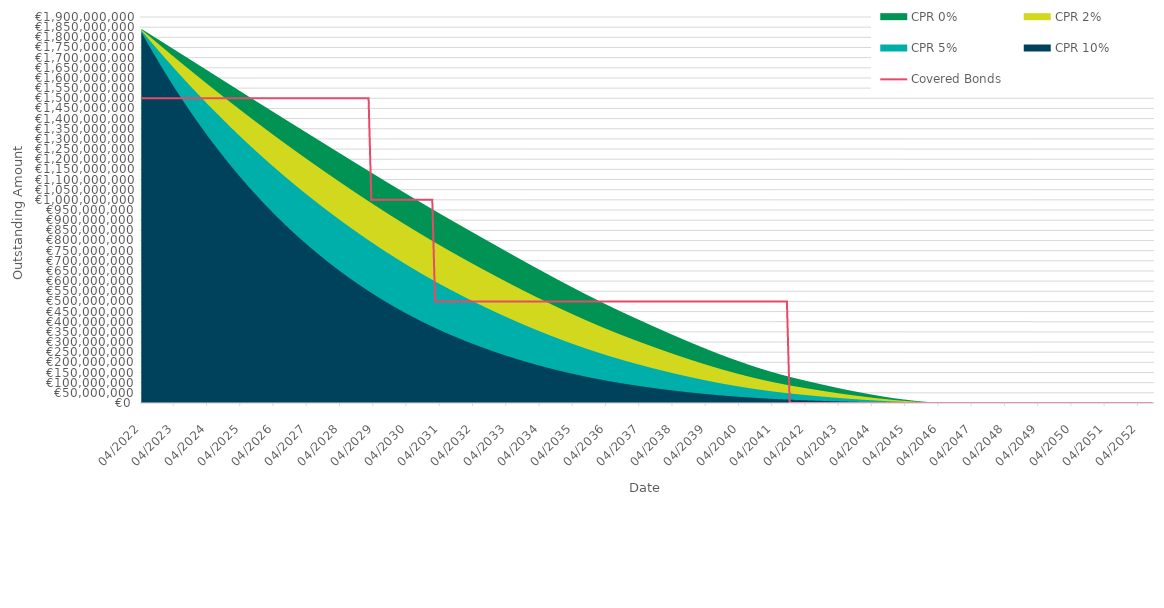
| Category | Covered Bonds |
|---|---|
| 2022-04-30 | 1500000000 |
| 2022-05-31 | 1500000000 |
| 2022-06-30 | 1500000000 |
| 2022-07-31 | 1500000000 |
| 2022-08-31 | 1500000000 |
| 2022-09-30 | 1500000000 |
| 2022-10-31 | 1500000000 |
| 2022-11-30 | 1500000000 |
| 2022-12-31 | 1500000000 |
| 2023-01-31 | 1500000000 |
| 2023-02-28 | 1500000000 |
| 2023-03-31 | 1500000000 |
| 2023-04-30 | 1500000000 |
| 2023-05-31 | 1500000000 |
| 2023-06-30 | 1500000000 |
| 2023-07-31 | 1500000000 |
| 2023-08-31 | 1500000000 |
| 2023-09-30 | 1500000000 |
| 2023-10-31 | 1500000000 |
| 2023-11-30 | 1500000000 |
| 2023-12-31 | 1500000000 |
| 2024-01-31 | 1500000000 |
| 2024-02-29 | 1500000000 |
| 2024-03-31 | 1500000000 |
| 2024-04-30 | 1500000000 |
| 2024-05-31 | 1500000000 |
| 2024-06-30 | 1500000000 |
| 2024-07-31 | 1500000000 |
| 2024-08-31 | 1500000000 |
| 2024-09-30 | 1500000000 |
| 2024-10-31 | 1500000000 |
| 2024-11-30 | 1500000000 |
| 2024-12-31 | 1500000000 |
| 2025-01-31 | 1500000000 |
| 2025-02-28 | 1500000000 |
| 2025-03-31 | 1500000000 |
| 2025-04-30 | 1500000000 |
| 2025-05-31 | 1500000000 |
| 2025-06-30 | 1500000000 |
| 2025-07-31 | 1500000000 |
| 2025-08-31 | 1500000000 |
| 2025-09-30 | 1500000000 |
| 2025-10-31 | 1500000000 |
| 2025-11-30 | 1500000000 |
| 2025-12-31 | 1500000000 |
| 2026-01-31 | 1500000000 |
| 2026-02-28 | 1500000000 |
| 2026-03-31 | 1500000000 |
| 2026-04-30 | 1500000000 |
| 2026-05-31 | 1500000000 |
| 2026-06-30 | 1500000000 |
| 2026-07-31 | 1500000000 |
| 2026-08-31 | 1500000000 |
| 2026-09-30 | 1500000000 |
| 2026-10-31 | 1500000000 |
| 2026-11-30 | 1500000000 |
| 2026-12-31 | 1500000000 |
| 2027-01-31 | 1500000000 |
| 2027-02-28 | 1500000000 |
| 2027-03-31 | 1500000000 |
| 2027-04-30 | 1500000000 |
| 2027-05-31 | 1500000000 |
| 2027-06-30 | 1500000000 |
| 2027-07-31 | 1500000000 |
| 2027-08-31 | 1500000000 |
| 2027-09-30 | 1500000000 |
| 2027-10-31 | 1500000000 |
| 2027-11-30 | 1500000000 |
| 2027-12-31 | 1500000000 |
| 2028-01-31 | 1500000000 |
| 2028-02-29 | 1500000000 |
| 2028-03-31 | 1500000000 |
| 2028-04-30 | 1500000000 |
| 2028-05-31 | 1500000000 |
| 2028-06-30 | 1500000000 |
| 2028-07-31 | 1500000000 |
| 2028-08-31 | 1500000000 |
| 2028-09-30 | 1500000000 |
| 2028-10-31 | 1500000000 |
| 2028-11-30 | 1500000000 |
| 2028-12-31 | 1500000000 |
| 2029-01-31 | 1500000000 |
| 2029-02-28 | 1500000000 |
| 2029-03-31 | 1000000000 |
| 2029-04-30 | 1000000000 |
| 2029-05-31 | 1000000000 |
| 2029-06-30 | 1000000000 |
| 2029-07-31 | 1000000000 |
| 2029-08-31 | 1000000000 |
| 2029-09-30 | 1000000000 |
| 2029-10-31 | 1000000000 |
| 2029-11-30 | 1000000000 |
| 2029-12-31 | 1000000000 |
| 2030-01-31 | 1000000000 |
| 2030-02-28 | 1000000000 |
| 2030-03-31 | 1000000000 |
| 2030-04-30 | 1000000000 |
| 2030-05-31 | 1000000000 |
| 2030-06-30 | 1000000000 |
| 2030-07-31 | 1000000000 |
| 2030-08-31 | 1000000000 |
| 2030-09-30 | 1000000000 |
| 2030-10-31 | 1000000000 |
| 2030-11-30 | 1000000000 |
| 2030-12-31 | 1000000000 |
| 2031-01-31 | 1000000000 |
| 2031-02-28 | 500000000 |
| 2031-03-31 | 500000000 |
| 2031-04-30 | 500000000 |
| 2031-05-31 | 500000000 |
| 2031-06-30 | 500000000 |
| 2031-07-31 | 500000000 |
| 2031-08-31 | 500000000 |
| 2031-09-30 | 500000000 |
| 2031-10-31 | 500000000 |
| 2031-11-30 | 500000000 |
| 2031-12-31 | 500000000 |
| 2032-01-31 | 500000000 |
| 2032-02-29 | 500000000 |
| 2032-03-31 | 500000000 |
| 2032-04-30 | 500000000 |
| 2032-05-31 | 500000000 |
| 2032-06-30 | 500000000 |
| 2032-07-31 | 500000000 |
| 2032-08-31 | 500000000 |
| 2032-09-30 | 500000000 |
| 2032-10-31 | 500000000 |
| 2032-11-30 | 500000000 |
| 2032-12-31 | 500000000 |
| 2033-01-31 | 500000000 |
| 2033-02-28 | 500000000 |
| 2033-03-31 | 500000000 |
| 2033-04-30 | 500000000 |
| 2033-05-31 | 500000000 |
| 2033-06-30 | 500000000 |
| 2033-07-31 | 500000000 |
| 2033-08-31 | 500000000 |
| 2033-09-30 | 500000000 |
| 2033-10-31 | 500000000 |
| 2033-11-30 | 500000000 |
| 2033-12-31 | 500000000 |
| 2034-01-31 | 500000000 |
| 2034-02-28 | 500000000 |
| 2034-03-31 | 500000000 |
| 2034-04-30 | 500000000 |
| 2034-05-31 | 500000000 |
| 2034-06-30 | 500000000 |
| 2034-07-31 | 500000000 |
| 2034-08-31 | 500000000 |
| 2034-09-30 | 500000000 |
| 2034-10-31 | 500000000 |
| 2034-11-30 | 500000000 |
| 2034-12-31 | 500000000 |
| 2035-01-31 | 500000000 |
| 2035-02-28 | 500000000 |
| 2035-03-31 | 500000000 |
| 2035-04-30 | 500000000 |
| 2035-05-31 | 500000000 |
| 2035-06-30 | 500000000 |
| 2035-07-31 | 500000000 |
| 2035-08-31 | 500000000 |
| 2035-09-30 | 500000000 |
| 2035-10-31 | 500000000 |
| 2035-11-30 | 500000000 |
| 2035-12-31 | 500000000 |
| 2036-01-31 | 500000000 |
| 2036-02-29 | 500000000 |
| 2036-03-31 | 500000000 |
| 2036-04-30 | 500000000 |
| 2036-05-31 | 500000000 |
| 2036-06-30 | 500000000 |
| 2036-07-31 | 500000000 |
| 2036-08-31 | 500000000 |
| 2036-09-30 | 500000000 |
| 2036-10-31 | 500000000 |
| 2036-11-30 | 500000000 |
| 2036-12-31 | 500000000 |
| 2037-01-31 | 500000000 |
| 2037-02-28 | 500000000 |
| 2037-03-31 | 500000000 |
| 2037-04-30 | 500000000 |
| 2037-05-31 | 500000000 |
| 2037-06-30 | 500000000 |
| 2037-07-31 | 500000000 |
| 2037-08-31 | 500000000 |
| 2037-09-30 | 500000000 |
| 2037-10-31 | 500000000 |
| 2037-11-30 | 500000000 |
| 2037-12-31 | 500000000 |
| 2038-01-31 | 500000000 |
| 2038-02-28 | 500000000 |
| 2038-03-31 | 500000000 |
| 2038-04-30 | 500000000 |
| 2038-05-31 | 500000000 |
| 2038-06-30 | 500000000 |
| 2038-07-31 | 500000000 |
| 2038-08-31 | 500000000 |
| 2038-09-30 | 500000000 |
| 2038-10-31 | 500000000 |
| 2038-11-30 | 500000000 |
| 2038-12-31 | 500000000 |
| 2039-01-31 | 500000000 |
| 2039-02-28 | 500000000 |
| 2039-03-31 | 500000000 |
| 2039-04-30 | 500000000 |
| 2039-05-31 | 500000000 |
| 2039-06-30 | 500000000 |
| 2039-07-31 | 500000000 |
| 2039-08-31 | 500000000 |
| 2039-09-30 | 500000000 |
| 2039-10-31 | 500000000 |
| 2039-11-30 | 500000000 |
| 2039-12-31 | 500000000 |
| 2040-01-31 | 500000000 |
| 2040-02-29 | 500000000 |
| 2040-03-31 | 500000000 |
| 2040-04-30 | 500000000 |
| 2040-05-31 | 500000000 |
| 2040-06-30 | 500000000 |
| 2040-07-31 | 500000000 |
| 2040-08-31 | 500000000 |
| 2040-09-30 | 500000000 |
| 2040-10-31 | 500000000 |
| 2040-11-30 | 500000000 |
| 2040-12-31 | 500000000 |
| 2041-01-31 | 500000000 |
| 2041-02-28 | 500000000 |
| 2041-03-31 | 500000000 |
| 2041-04-30 | 500000000 |
| 2041-05-31 | 500000000 |
| 2041-06-30 | 500000000 |
| 2041-07-31 | 500000000 |
| 2041-08-31 | 500000000 |
| 2041-09-30 | 500000000 |
| 2041-10-31 | 0 |
| 2041-11-30 | 0 |
| 2041-12-31 | 0 |
| 2042-01-31 | 0 |
| 2042-02-28 | 0 |
| 2042-03-31 | 0 |
| 2042-04-30 | 0 |
| 2042-05-31 | 0 |
| 2042-06-30 | 0 |
| 2042-07-31 | 0 |
| 2042-08-31 | 0 |
| 2042-09-30 | 0 |
| 2042-10-31 | 0 |
| 2042-11-30 | 0 |
| 2042-12-31 | 0 |
| 2043-01-31 | 0 |
| 2043-02-28 | 0 |
| 2043-03-31 | 0 |
| 2043-04-30 | 0 |
| 2043-05-31 | 0 |
| 2043-06-30 | 0 |
| 2043-07-31 | 0 |
| 2043-08-31 | 0 |
| 2043-09-30 | 0 |
| 2043-10-31 | 0 |
| 2043-11-30 | 0 |
| 2043-12-31 | 0 |
| 2044-01-31 | 0 |
| 2044-02-29 | 0 |
| 2044-03-31 | 0 |
| 2044-04-30 | 0 |
| 2044-05-31 | 0 |
| 2044-06-30 | 0 |
| 2044-07-31 | 0 |
| 2044-08-31 | 0 |
| 2044-09-30 | 0 |
| 2044-10-31 | 0 |
| 2044-11-30 | 0 |
| 2044-12-31 | 0 |
| 2045-01-31 | 0 |
| 2045-02-28 | 0 |
| 2045-03-31 | 0 |
| 2045-04-30 | 0 |
| 2045-05-31 | 0 |
| 2045-06-30 | 0 |
| 2045-07-31 | 0 |
| 2045-08-31 | 0 |
| 2045-09-30 | 0 |
| 2045-10-31 | 0 |
| 2045-11-30 | 0 |
| 2045-12-31 | 0 |
| 2046-01-31 | 0 |
| 2046-02-28 | 0 |
| 2046-03-31 | 0 |
| 2046-04-30 | 0 |
| 2046-05-31 | 0 |
| 2046-06-30 | 0 |
| 2046-07-31 | 0 |
| 2046-08-31 | 0 |
| 2046-09-30 | 0 |
| 2046-10-31 | 0 |
| 2046-11-30 | 0 |
| 2046-12-31 | 0 |
| 2047-01-31 | 0 |
| 2047-02-28 | 0 |
| 2047-03-31 | 0 |
| 2047-04-30 | 0 |
| 2047-05-31 | 0 |
| 2047-06-30 | 0 |
| 2047-07-31 | 0 |
| 2047-08-31 | 0 |
| 2047-09-30 | 0 |
| 2047-10-31 | 0 |
| 2047-11-30 | 0 |
| 2047-12-31 | 0 |
| 2048-01-31 | 0 |
| 2048-02-29 | 0 |
| 2048-03-31 | 0 |
| 2048-04-30 | 0 |
| 2048-05-31 | 0 |
| 2048-06-30 | 0 |
| 2048-07-31 | 0 |
| 2048-08-31 | 0 |
| 2048-09-30 | 0 |
| 2048-10-31 | 0 |
| 2048-11-30 | 0 |
| 2048-12-31 | 0 |
| 2049-01-31 | 0 |
| 2049-02-28 | 0 |
| 2049-03-31 | 0 |
| 2049-04-30 | 0 |
| 2049-05-31 | 0 |
| 2049-06-30 | 0 |
| 2049-07-31 | 0 |
| 2049-08-31 | 0 |
| 2049-09-30 | 0 |
| 2049-10-31 | 0 |
| 2049-11-30 | 0 |
| 2049-12-31 | 0 |
| 2050-01-31 | 0 |
| 2050-02-28 | 0 |
| 2050-03-31 | 0 |
| 2050-04-30 | 0 |
| 2050-05-31 | 0 |
| 2050-06-30 | 0 |
| 2050-07-31 | 0 |
| 2050-08-31 | 0 |
| 2050-09-30 | 0 |
| 2050-10-31 | 0 |
| 2050-11-30 | 0 |
| 2050-12-31 | 0 |
| 2051-01-31 | 0 |
| 2051-02-28 | 0 |
| 2051-03-31 | 0 |
| 2051-04-30 | 0 |
| 2051-05-31 | 0 |
| 2051-06-30 | 0 |
| 2051-07-31 | 0 |
| 2051-08-31 | 0 |
| 2051-09-30 | 0 |
| 2051-10-31 | 0 |
| 2051-11-30 | 0 |
| 2051-12-31 | 0 |
| 2052-01-31 | 0 |
| 2052-02-29 | 0 |
| 2052-03-31 | 0 |
| 2052-04-30 | 0 |
| 2052-05-31 | 0 |
| 2052-06-30 | 0 |
| 2052-07-31 | 0 |
| 2052-08-31 | 0 |
| 2052-09-30 | 0 |